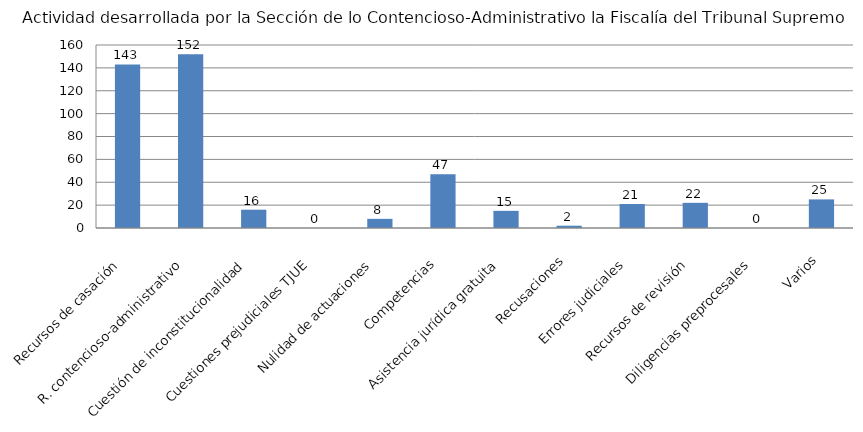
| Category | Series 0 |
|---|---|
| Recursos de casación  | 143 |
| R. contencioso-administrativo  | 152 |
| Cuestión de inconstitucionalidad  | 16 |
| Cuestiones prejudiciales TJUE  | 0 |
| Nulidad de actuaciones  | 8 |
| Competencias  | 47 |
| Asistencia jurídica gratuita  | 15 |
| Recusaciones  | 2 |
| Errores judiciales  | 21 |
| Recursos de revisión  | 22 |
| Diligencias preprocesales  | 0 |
| Varios | 25 |